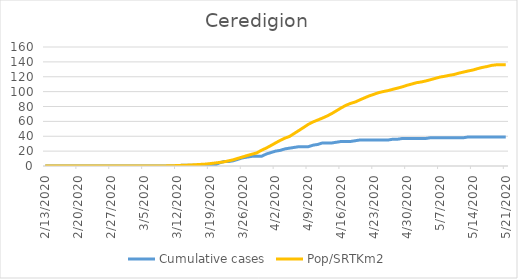
| Category | Cumulative cases | Pop/SRTKm2 |
|---|---|---|
| 5/21/20 | 39 | 136.061 |
| 5/20/20 | 39 | 136.061 |
| 5/19/20 | 39 | 136.029 |
| 5/18/20 | 39 | 135.284 |
| 5/17/20 | 39 | 133.696 |
| 5/16/20 | 39 | 132.514 |
| 5/15/20 | 39 | 130.852 |
| 5/14/20 | 39 | 129.009 |
| 5/13/20 | 39 | 127.73 |
| 5/12/20 | 38 | 126.26 |
| 5/11/20 | 38 | 124.8 |
| 5/10/20 | 38 | 122.989 |
| 5/9/20 | 38 | 121.934 |
| 5/8/20 | 38 | 120.613 |
| 5/7/20 | 38 | 119.548 |
| 5/6/20 | 38 | 117.79 |
| 5/5/20 | 38 | 116.032 |
| 5/4/20 | 37 | 114.338 |
| 5/3/20 | 37 | 112.974 |
| 5/2/20 | 37 | 111.973 |
| 5/1/20 | 37 | 110.194 |
| 4/30/20 | 37 | 108.51 |
| 4/29/20 | 37 | 106.465 |
| 4/28/20 | 36 | 104.728 |
| 4/27/20 | 36 | 103.173 |
| 4/26/20 | 35 | 101.425 |
| 4/25/20 | 35 | 100.158 |
| 4/24/20 | 35 | 98.719 |
| 4/23/20 | 35 | 96.514 |
| 4/22/20 | 35 | 94.405 |
| 4/21/20 | 35 | 91.73 |
| 4/20/20 | 35 | 89.035 |
| 4/19/20 | 34 | 86.105 |
| 4/18/20 | 33 | 84.209 |
| 4/17/20 | 33 | 81.62 |
| 4/16/20 | 33 | 78.189 |
| 4/15/20 | 32 | 74.364 |
| 4/14/20 | 31 | 70.582 |
| 4/13/20 | 31 | 67.28 |
| 4/12/20 | 31 | 64.435 |
| 4/11/20 | 29 | 61.846 |
| 4/10/20 | 28 | 59.247 |
| 4/9/20 | 26 | 56.05 |
| 4/8/20 | 26 | 51.895 |
| 4/7/20 | 26 | 47.815 |
| 4/6/20 | 25 | 43.809 |
| 4/5/20 | 24 | 39.771 |
| 4/4/20 | 23 | 37.417 |
| 4/3/20 | 21 | 34.423 |
| 4/2/20 | 20 | 30.971 |
| 4/1/20 | 18 | 27.423 |
| 3/31/20 | 16 | 24.014 |
| 3/30/20 | 13 | 21.127 |
| 3/29/20 | 13 | 17.568 |
| 3/28/20 | 13 | 15.906 |
| 3/27/20 | 12 | 14.138 |
| 3/26/20 | 11 | 12.167 |
| 3/25/20 | 9 | 10.313 |
| 3/24/20 | 7 | 8.363 |
| 3/23/20 | 6 | 6.925 |
| 3/22/20 | 6 | 5.54 |
| 3/21/20 | 4 | 4.73 |
| 3/20/20 | 1 | 3.931 |
| 3/19/20 | 1 | 3.164 |
| 3/18/20 | 1 | 2.525 |
| 3/17/20 | 1 | 2.152 |
| 3/16/20 | 1 | 1.758 |
| 3/15/20 | 1 | 1.396 |
| 3/14/20 | 1 | 1.087 |
| 3/13/20 | 1 | 0.884 |
| 3/12/20 | 0 | 0.597 |
| 3/11/20 | 0 | 0.341 |
| 3/10/20 | 0 | 0.192 |
| 3/9/20 | 0 | 0.075 |
| 3/8/20 | 0 | 0.043 |
| 3/7/20 | 0 | 0.043 |
| 3/6/20 | 0 | 0.021 |
| 3/5/20 | 0 | 0.021 |
| 3/4/20 | 0 | 0.021 |
| 3/3/20 | 0 | 0.011 |
| 3/2/20 | 0 | 0.011 |
| 3/1/20 | 0 | 0.011 |
| 2/29/20 | 0 | 0.011 |
| 2/28/20 | 0 | 0.011 |
| 2/27/20 | 0 | 0.011 |
| 2/26/20 | 0 | 0 |
| 2/25/20 | 0 | 0 |
| 2/24/20 | 0 | 0 |
| 2/23/20 | 0 | 0 |
| 2/22/20 | 0 | 0 |
| 2/21/20 | 0 | 0 |
| 2/20/20 | 0 | 0 |
| 2/19/20 | 0 | 0 |
| 2/18/20 | 0 | 0 |
| 2/17/20 | 0 | 0 |
| 2/16/20 | 0 | 0 |
| 2/15/20 | 0 | 0 |
| 2/14/20 | 0 | 0 |
| 2/13/20 | 0 | 0 |